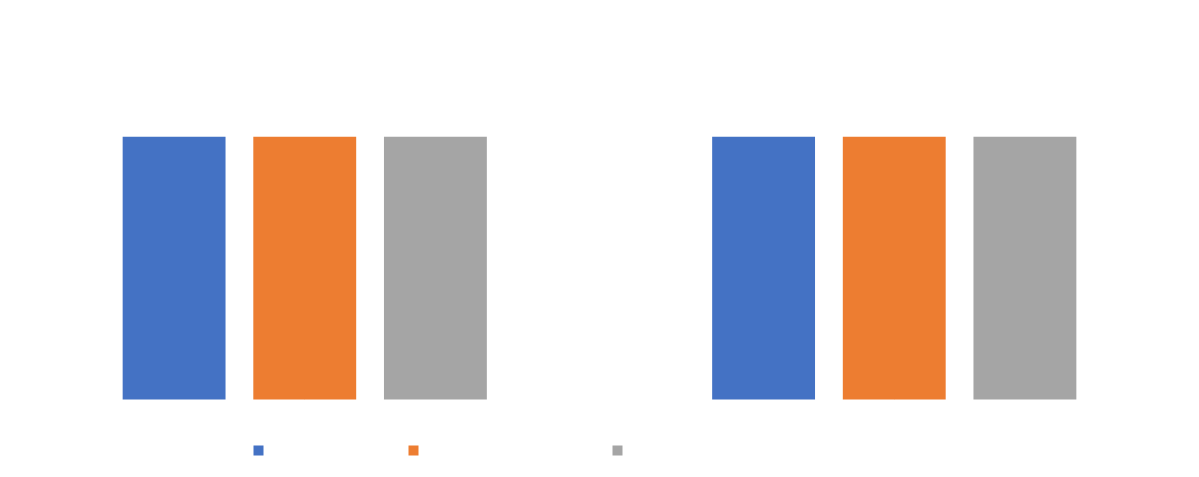
| Category | Students | Teaching staff | Professional services staff |
|---|---|---|---|
| On campus | 0.5 | 0.5 | 0.5 |
| Off campus | 0.5 | 0.5 | 0.5 |